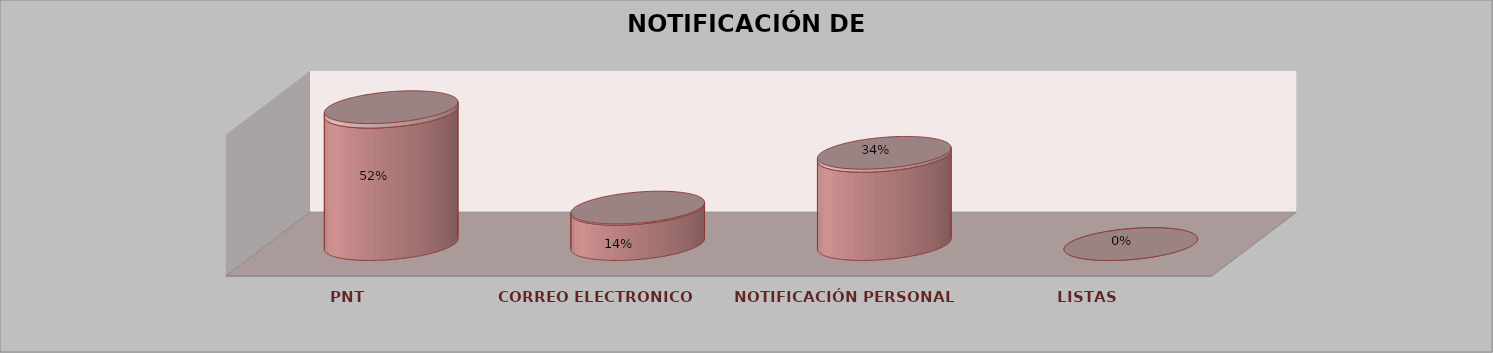
| Category | Series 0 | Series 1 | Series 2 | Series 3 | Series 4 |
|---|---|---|---|---|---|
| PNT |  |  |  | 15 | 0.517 |
| CORREO ELECTRONICO |  |  |  | 4 | 0.138 |
| NOTIFICACIÓN PERSONAL |  |  |  | 10 | 0.345 |
| LISTAS |  |  |  | 0 | 0 |